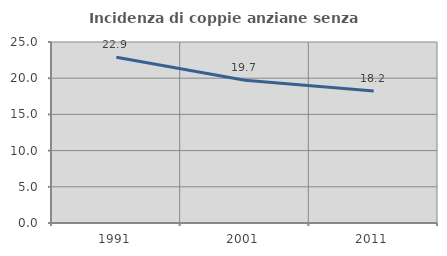
| Category | Incidenza di coppie anziane senza figli  |
|---|---|
| 1991.0 | 22.881 |
| 2001.0 | 19.718 |
| 2011.0 | 18.224 |